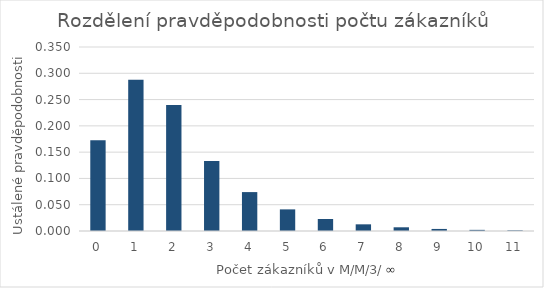
| Category | Series 0 |
|---|---|
| 0.0 | 0.173 |
| 1.0 | 0.288 |
| 2.0 | 0.24 |
| 3.0 | 0.133 |
| 4.0 | 0.074 |
| 5.0 | 0.041 |
| 6.0 | 0.023 |
| 7.0 | 0.013 |
| 8.0 | 0.007 |
| 9.0 | 0.004 |
| 10.0 | 0.002 |
| 11.0 | 0.001 |